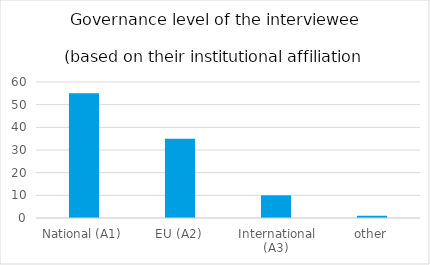
| Category | Series 0 |
|---|---|
| National (A1) | 55 |
| EU (A2) | 35 |
| International (A3) | 10 |
| other | 1 |